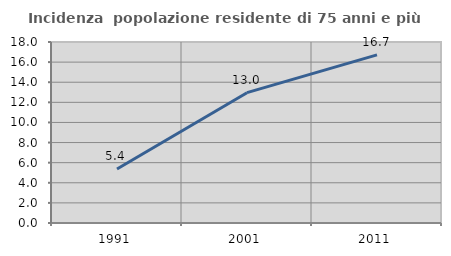
| Category | Incidenza  popolazione residente di 75 anni e più |
|---|---|
| 1991.0 | 5.363 |
| 2001.0 | 12.96 |
| 2011.0 | 16.722 |